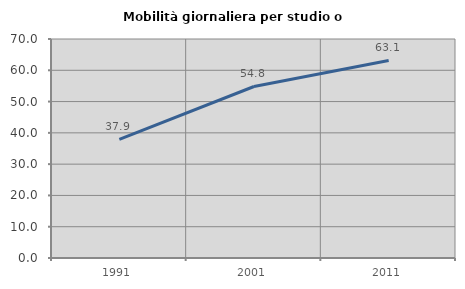
| Category | Mobilità giornaliera per studio o lavoro |
|---|---|
| 1991.0 | 37.935 |
| 2001.0 | 54.821 |
| 2011.0 | 63.147 |